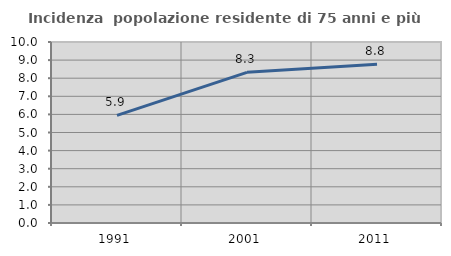
| Category | Incidenza  popolazione residente di 75 anni e più |
|---|---|
| 1991.0 | 5.949 |
| 2001.0 | 8.324 |
| 2011.0 | 8.77 |